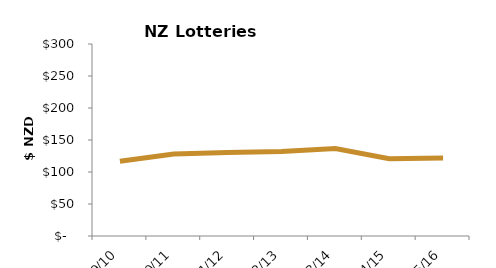
| Category | Inflation adjusted expenditure per capita |
|---|---|
| 2009/10 | 116.778 |
| 2010/11 | 128.194 |
| 2011/12 | 130.456 |
| 2012/13 | 132.204 |
| 2013/14 | 136.799 |
| 2014/15 | 120.795 |
| 2015/16 | 121.997 |